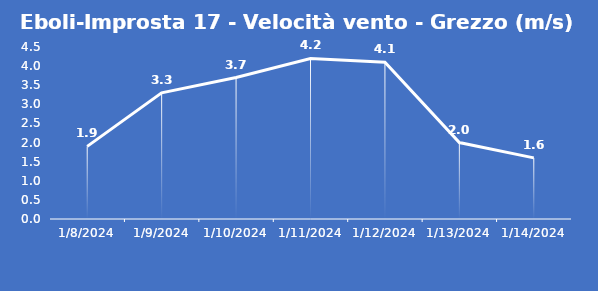
| Category | Eboli-Improsta 17 - Velocità vento - Grezzo (m/s) |
|---|---|
| 1/8/24 | 1.9 |
| 1/9/24 | 3.3 |
| 1/10/24 | 3.7 |
| 1/11/24 | 4.2 |
| 1/12/24 | 4.1 |
| 1/13/24 | 2 |
| 1/14/24 | 1.6 |